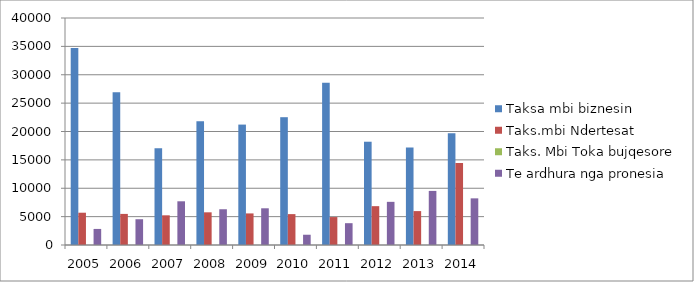
| Category | Taksa mbi biznesin  | Taks.mbi Ndertesat | Taks. Mbi Toka bujqesore | Te ardhura nga pronesia |
|---|---|---|---|---|
| 2005.0 | 34731 | 5689 | 0 | 2832 |
| 2006.0 | 26930 | 5479 | 0 | 4542 |
| 2007.0 | 17057 | 5231 | 0 | 7702 |
| 2008.0 | 21822 | 5760 | 0 | 6299 |
| 2009.0 | 21218 | 5566 | 0 | 6468 |
| 2010.0 | 22521 | 5442 | 0 | 1809 |
| 2011.0 | 28578 | 4922 | 0 | 3844 |
| 2012.0 | 18199 | 6844 | 0 | 7605 |
| 2013.0 | 17174 | 5974 | 0 | 9530 |
| 2014.0 | 19678 | 14447 | 0 | 8220 |